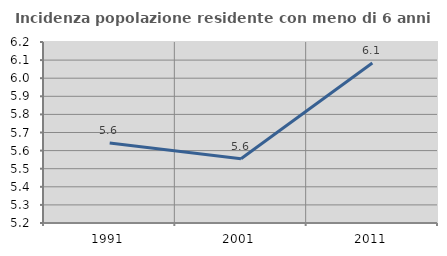
| Category | Incidenza popolazione residente con meno di 6 anni |
|---|---|
| 1991.0 | 5.642 |
| 2001.0 | 5.555 |
| 2011.0 | 6.084 |